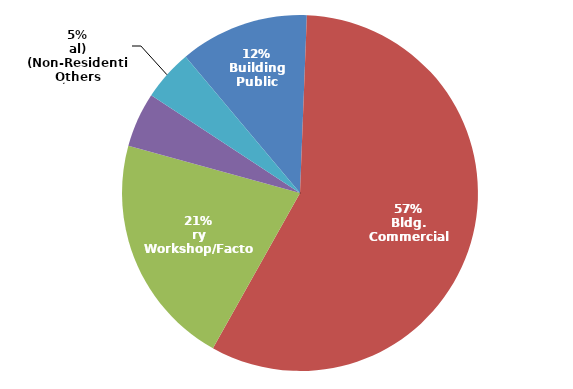
| Category | Series 0 |
|---|---|
| ادارة حكومية
Public Building | 106 |
| مبنى تجاري
Commercial Bldg. | 520 |
| ورشة / مصنع
Workshop/Factory | 191 |
| مسجد
Mosque | 45 |
| أخرى
Others (Non-Residential) | 42 |